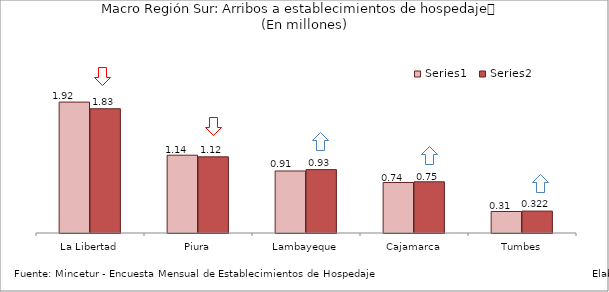
| Category | Series 0 | Series 1 |
|---|---|---|
| La Libertad | 1.925 | 1.827 |
| Piura | 1.144 | 1.12 |
| Lambayeque | 0.912 | 0.932 |
| Cajamarca | 0.742 | 0.753 |
| Tumbes | 0.316 | 0.322 |